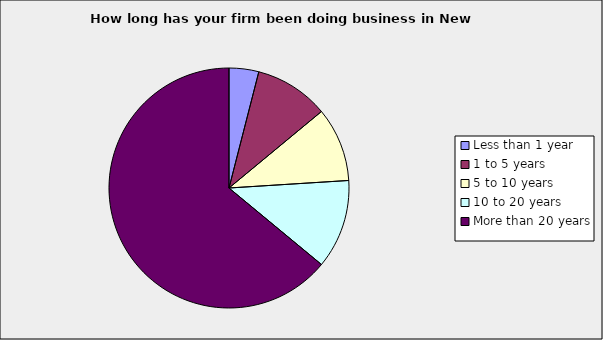
| Category | Series 0 |
|---|---|
| Less than 1 year | 0.04 |
| 1 to 5 years | 0.1 |
| 5 to 10 years | 0.1 |
| 10 to 20 years | 0.12 |
| More than 20 years | 0.64 |